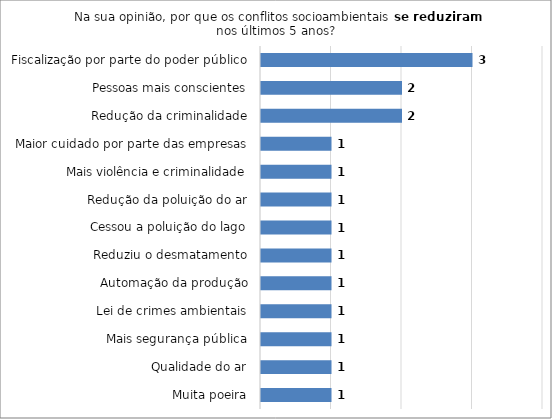
| Category | Series 0 |
|---|---|
| Muita poeira | 1 |
| Qualidade do ar | 1 |
| Mais segurança pública | 1 |
| Lei de crimes ambientais | 1 |
| Automação da produção | 1 |
| Reduziu o desmatamento | 1 |
| Cessou a poluição do lago | 1 |
| Redução da poluição do ar | 1 |
| Mais violência e criminalidade | 1 |
| Maior cuidado por parte das empresas | 1 |
| Redução da criminalidade | 2 |
| Pessoas mais conscientes | 2 |
| Fiscalização por parte do poder público | 3 |